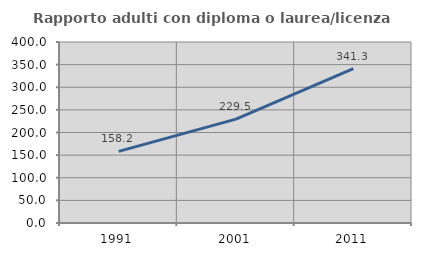
| Category | Rapporto adulti con diploma o laurea/licenza media  |
|---|---|
| 1991.0 | 158.214 |
| 2001.0 | 229.497 |
| 2011.0 | 341.29 |